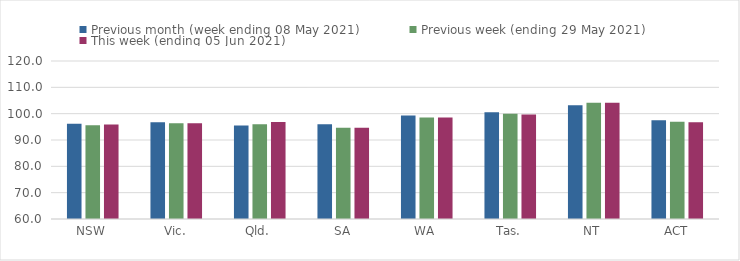
| Category | Previous month (week ending 08 May 2021) | Previous week (ending 29 May 2021) | This week (ending 05 Jun 2021) |
|---|---|---|---|
| NSW | 96.2 | 95.62 | 95.85 |
| Vic. | 96.78 | 96.35 | 96.38 |
| Qld. | 95.54 | 95.96 | 96.88 |
| SA | 96.02 | 94.61 | 94.61 |
| WA | 99.26 | 98.58 | 98.58 |
| Tas. | 100.57 | 99.97 | 99.66 |
| NT | 103.15 | 104.16 | 104.16 |
| ACT | 97.49 | 96.96 | 96.72 |